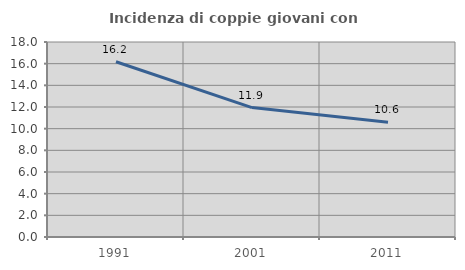
| Category | Incidenza di coppie giovani con figli |
|---|---|
| 1991.0 | 16.176 |
| 2001.0 | 11.944 |
| 2011.0 | 10.603 |